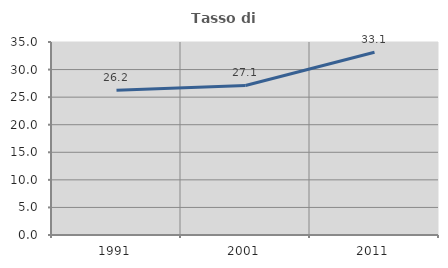
| Category | Tasso di occupazione   |
|---|---|
| 1991.0 | 26.247 |
| 2001.0 | 27.115 |
| 2011.0 | 33.135 |